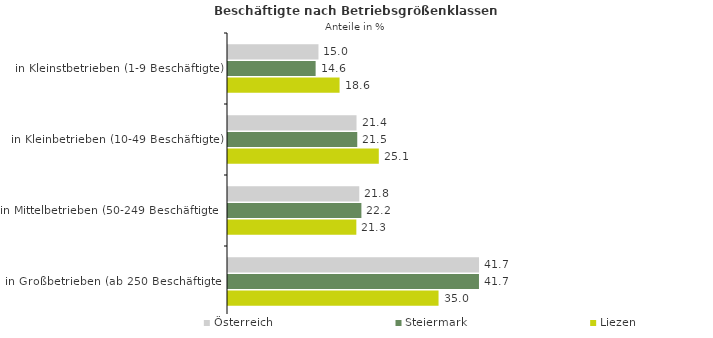
| Category | Österreich | Steiermark | Liezen |
|---|---|---|---|
| in Kleinstbetrieben (1-9 Beschäftigte) | 15.046 | 14.574 | 18.556 |
| in Kleinbetrieben (10-49 Beschäftigte) | 21.375 | 21.498 | 25.081 |
| in Mittelbetrieben (50-249 Beschäftigte) | 21.831 | 22.187 | 21.345 |
| in Großbetrieben (ab 250 Beschäftigte) | 41.748 | 41.742 | 35.018 |